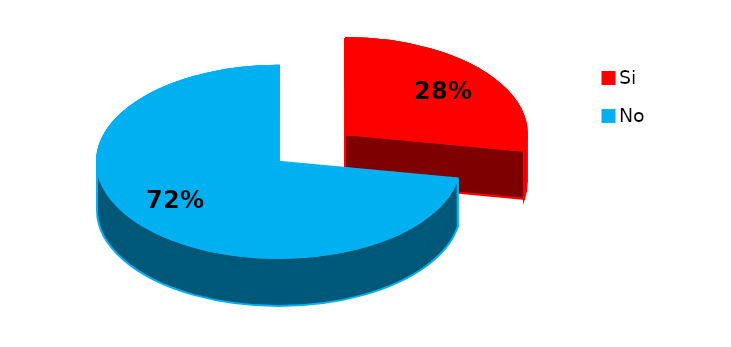
| Category | Series 0 |
|---|---|
| 0 | 5 |
| 1 | 13 |